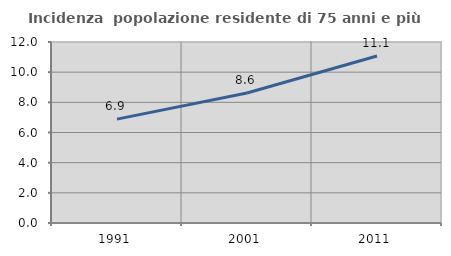
| Category | Incidenza  popolazione residente di 75 anni e più |
|---|---|
| 1991.0 | 6.886 |
| 2001.0 | 8.616 |
| 2011.0 | 11.069 |